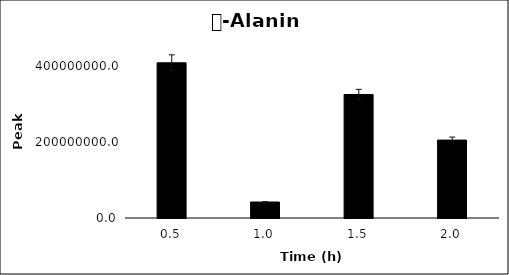
| Category | Series 0 |
|---|---|
| 0.5 | 408412209 |
| 1.0 | 42044175.667 |
| 1.5 | 325002361.667 |
| 2.0 | 205020401.333 |